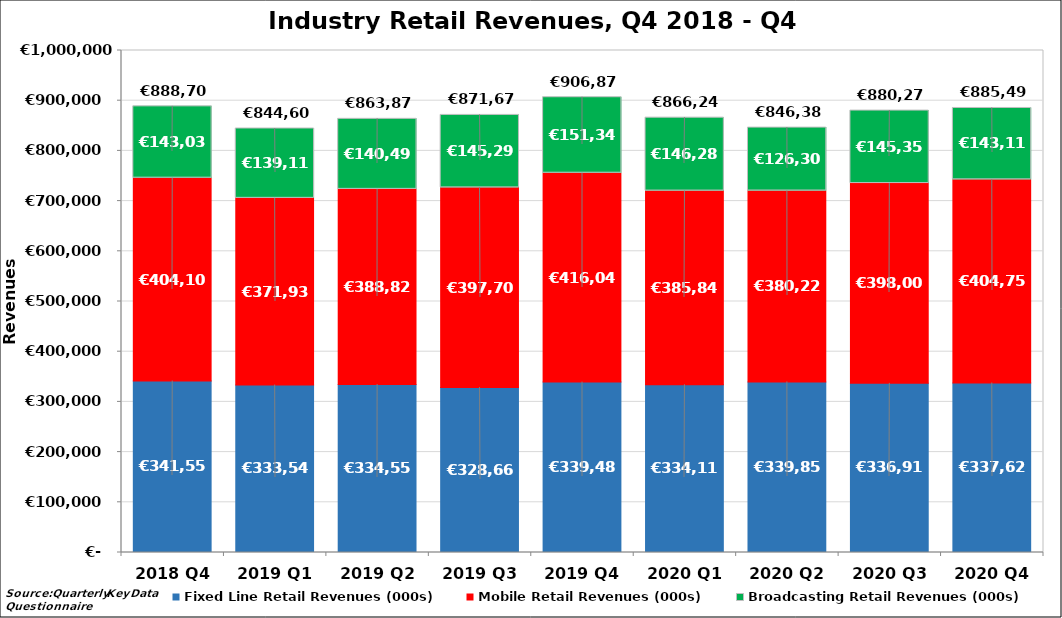
| Category | Fixed Line Retail Revenues (000s) | Mobile Retail Revenues (000s) | Broadcasting Retail Revenues (000s) |
|---|---|---|---|
| 2018 Q4 | 341555.412 | 404108.118 | 143038.444 |
| 2019 Q1 | 333546.469 | 371937.702 | 139116.768 |
| 2019 Q2 | 334555.661 | 388825.881 | 140493.699 |
| 2019 Q3 | 328666.506 | 397708.31 | 145297.666 |
| 2019 Q4 | 339487.178 | 416043.983 | 151346.492 |
| 2020 Q1 | 334116.414 | 385845.453 | 146283 |
| 2020 Q2 | 339854.93 | 380223 | 126307 |
| 2020 Q3 | 336917.251 | 398002 | 145352.467 |
| 2020 Q4 | 337625.779 | 404750.93 | 143115.932 |